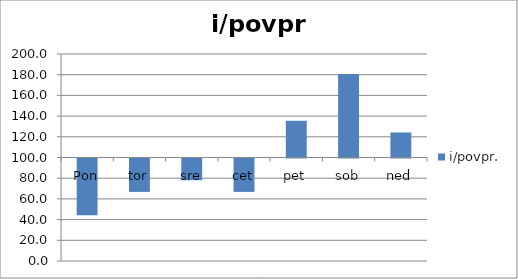
| Category | i/povpr. |
|---|---|
| Pon | 45.161 |
| tor | 67.742 |
| sre | 79.032 |
| cet | 67.742 |
| pet | 135.484 |
| sob | 180.645 |
| ned | 124.194 |